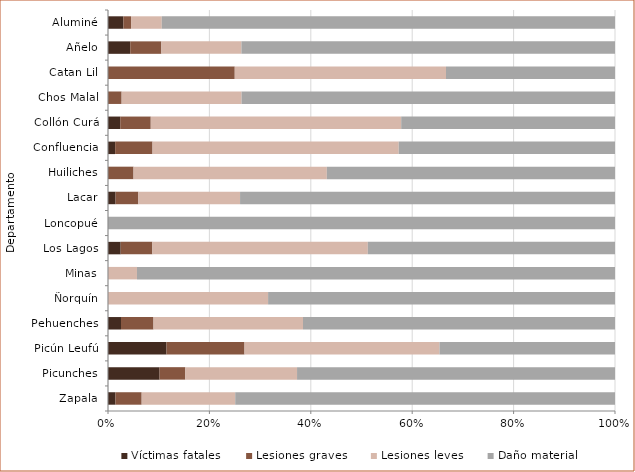
| Category | Víctimas fatales | Lesiones graves | Lesiones leves | Daño material |
|---|---|---|---|---|
| Zapala | 4 | 14 | 50 | 203 |
| Picunches | 6 | 3 | 13 | 37 |
| Picún Leufú | 3 | 4 | 10 | 9 |
| Pehuenches | 2 | 5 | 23 | 48 |
| Ñorquín | 0 | 0 | 6 | 13 |
| Minas | 0 | 0 | 2 | 33 |
| Los Lagos | 2 | 5 | 34 | 39 |
| Loncopué | 0 | 0 | 0 | 3 |
| Lacar | 5 | 15 | 67 | 247 |
| Huiliches | 0 | 7 | 53 | 79 |
| Confluencia | 27 | 141 | 929 | 816 |
| Collón Curá | 2 | 5 | 41 | 35 |
| Chos Malal | 0 | 5 | 44 | 137 |
| Catan Lil | 0 | 3 | 5 | 4 |
| Añelo | 5 | 7 | 18 | 84 |
| Aluminé | 2 | 1 | 4 | 59 |